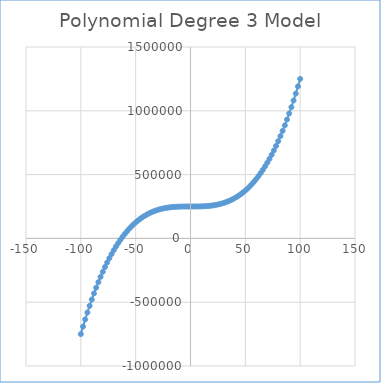
| Category | Series 0 |
|---|---|
| -100.0 | -750000 |
| -98.0 | -691192 |
| -96.0 | -634736 |
| -94.0 | -580584 |
| -92.0 | -528688 |
| -90.0 | -479000 |
| -88.0 | -431472 |
| -86.0 | -386056 |
| -84.0 | -342704 |
| -82.0 | -301368 |
| -80.0 | -262000 |
| -78.0 | -224552 |
| -76.0 | -188976 |
| -74.0 | -155224 |
| -72.0 | -123248 |
| -70.0 | -93000 |
| -68.0 | -64432 |
| -66.0 | -37496 |
| -64.0 | -12144 |
| -62.0 | 11672 |
| -60.0 | 34000 |
| -58.0 | 54888 |
| -56.0 | 74384 |
| -54.0 | 92536 |
| -52.0 | 109392 |
| -50.0 | 125000 |
| -48.0 | 139408 |
| -46.0 | 152664 |
| -44.0 | 164816 |
| -42.0 | 175912 |
| -40.0 | 186000 |
| -38.0 | 195128 |
| -36.0 | 203344 |
| -34.0 | 210696 |
| -32.0 | 217232 |
| -30.0 | 223000 |
| -28.0 | 228048 |
| -26.0 | 232424 |
| -24.0 | 236176 |
| -22.0 | 239352 |
| -20.0 | 242000 |
| -18.0 | 244168 |
| -16.0 | 245904 |
| -14.0 | 247256 |
| -12.0 | 248272 |
| -10.0 | 249000 |
| -8.0 | 249488 |
| -6.0 | 249784 |
| -4.0 | 249936 |
| -2.0 | 249992 |
| 0.0 | 250000 |
| 2.0 | 250008 |
| 4.0 | 250064 |
| 6.0 | 250216 |
| 8.0 | 250512 |
| 10.0 | 251000 |
| 12.0 | 251728 |
| 14.0 | 252744 |
| 16.0 | 254096 |
| 18.0 | 255832 |
| 20.0 | 258000 |
| 22.0 | 260648 |
| 24.0 | 263824 |
| 26.0 | 267576 |
| 28.0 | 271952 |
| 30.0 | 277000 |
| 32.0 | 282768 |
| 34.0 | 289304 |
| 36.0 | 296656 |
| 38.0 | 304872 |
| 40.0 | 314000 |
| 42.0 | 324088 |
| 44.0 | 335184 |
| 46.0 | 347336 |
| 48.0 | 360592 |
| 50.0 | 375000 |
| 52.0 | 390608 |
| 54.0 | 407464 |
| 56.0 | 425616 |
| 58.0 | 445112 |
| 60.0 | 466000 |
| 62.0 | 488328 |
| 64.0 | 512144 |
| 66.0 | 537496 |
| 68.0 | 564432 |
| 70.0 | 593000 |
| 72.0 | 623248 |
| 74.0 | 655224 |
| 76.0 | 688976 |
| 78.0 | 724552 |
| 80.0 | 762000 |
| 82.0 | 801368 |
| 84.0 | 842704 |
| 86.0 | 886056 |
| 88.0 | 931472 |
| 90.0 | 979000 |
| 92.0 | 1028688 |
| 94.0 | 1080584 |
| 96.0 | 1134736 |
| 98.0 | 1191192 |
| 100.0 | 1250000 |